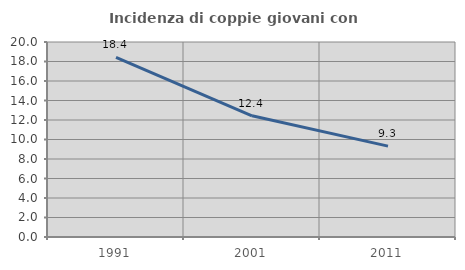
| Category | Incidenza di coppie giovani con figli |
|---|---|
| 1991.0 | 18.433 |
| 2001.0 | 12.431 |
| 2011.0 | 9.321 |